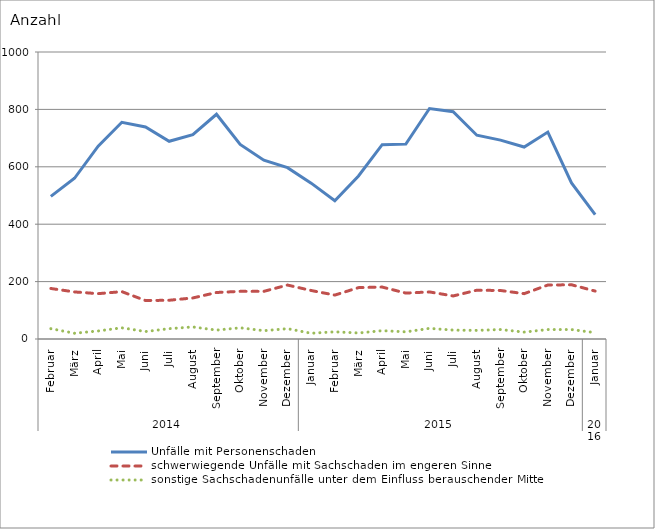
| Category | Unfälle mit Personenschaden | schwerwiegende Unfälle mit Sachschaden im engeren Sinne | sonstige Sachschadenunfälle unter dem Einfluss berauschender Mittel |
|---|---|---|---|
| 0 | 497 | 176 | 36 |
| 1 | 560 | 164 | 20 |
| 2 | 672 | 158 | 28 |
| 3 | 755 | 165 | 39 |
| 4 | 739 | 134 | 26 |
| 5 | 689 | 135 | 36 |
| 6 | 712 | 143 | 42 |
| 7 | 783 | 162 | 31 |
| 8 | 678 | 166 | 39 |
| 9 | 623 | 166 | 29 |
| 10 | 597 | 188 | 36 |
| 11 | 543 | 169 | 20 |
| 12 | 482 | 153 | 25 |
| 13 | 568 | 179 | 21 |
| 14 | 677 | 181 | 29 |
| 15 | 679 | 160 | 25 |
| 16 | 803 | 164 | 37 |
| 17 | 792 | 150 | 31 |
| 18 | 710 | 170 | 30 |
| 19 | 693 | 169 | 33 |
| 20 | 669 | 158 | 24 |
| 21 | 721 | 188 | 33 |
| 22 | 544 | 189 | 33 |
| 23 | 433 | 167 | 22 |